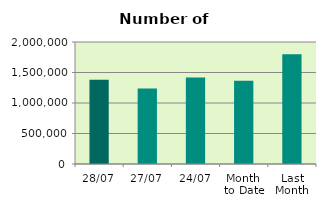
| Category | Series 0 |
|---|---|
| 28/07 | 1381878 |
| 27/07 | 1237348 |
| 24/07 | 1417178 |
| Month 
to Date | 1366057.6 |
| Last
Month | 1799892.818 |